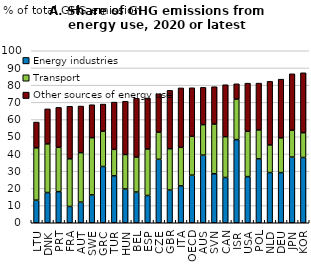
| Category | Energy industries | Transport | Other sources of energy use |
|---|---|---|---|
| LTU | 13.119 | 30.448 | 14.982 |
| DNK | 17.57 | 28.29 | 20.361 |
| PRT | 18.08 | 25.813 | 23.174 |
| FRA | 9.473 | 27.694 | 30.56 |
| AUT | 11.968 | 28.784 | 27.094 |
| SWE | 16.198 | 33.252 | 19.176 |
| GRC | 32.72 | 20.523 | 15.739 |
| TUR | 27.281 | 15.4 | 27.48 |
| HUN | 19.641 | 20.034 | 30.984 |
| BEL | 17.865 | 20.352 | 34.139 |
| ESP | 15.854 | 27.027 | 29.667 |
| CZE | 36.886 | 15.769 | 22.336 |
| GBR | 19.019 | 24.018 | 33.932 |
| ITA | 21.455 | 22.41 | 34.536 |
| OECD | 27.663 | 22.63 | 28.193 |
| AUS | 39.336 | 17.708 | 21.68 |
| SVN | 28.494 | 28.9 | 21.705 |
| CAN | 26.322 | 23.73 | 30.191 |
| ISR | 48.337 | 23.58 | 8.876 |
| USA | 26.834 | 26.341 | 27.989 |
| POL | 37.166 | 16.817 | 27.215 |
| NLD | 29.181 | 16.062 | 36.971 |
| DEU | 29.157 | 20.193 | 34.137 |
| JPN | 38.201 | 15.608 | 32.798 |
| KOR | 37.958 | 14.399 | 34.83 |